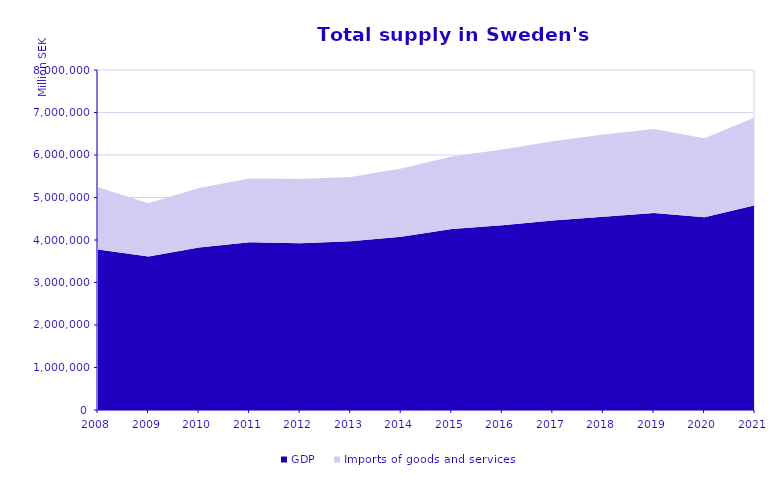
| Category | GDP | Imports of goods and services |
|---|---|---|
| 2008.0 | 3775090 | 1466856 |
| 2009.0 | 3611259 | 1253644 |
| 2010.0 | 3826205 | 1397605 |
| 2011.0 | 3948465 | 1496611 |
| 2012.0 | 3925236 | 1511785 |
| 2013.0 | 3971859 | 1508764 |
| 2014.0 | 4077423 | 1605077 |
| 2015.0 | 4260470 | 1702358 |
| 2016.0 | 4348687 | 1778450 |
| 2017.0 | 4460358 | 1862549 |
| 2018.0 | 4547336 | 1933770 |
| 2019.0 | 4637655 | 1974941 |
| 2020.0 | 4537008 | 1855480 |
| 2021.0 | 4815899 | 2070359 |